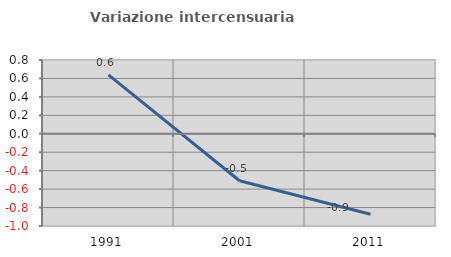
| Category | Variazione intercensuaria annua |
|---|---|
| 1991.0 | 0.639 |
| 2001.0 | -0.51 |
| 2011.0 | -0.872 |